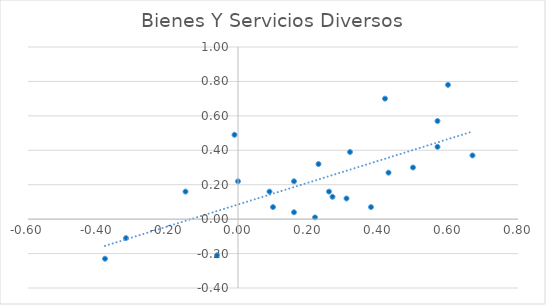
| Category | Bienes Y Servicios Diversos |
|---|---|
| 0.38 | 0.07 |
| -0.15 | 0.16 |
| -0.06 | -0.21 |
| 0.32 | 0.39 |
| -0.01 | 0.49 |
| 0.0 | 0.22 |
| -0.38 | -0.23 |
| -0.32 | -0.11 |
| 0.16 | 0.22 |
| 0.57 | 0.42 |
| 0.67 | 0.37 |
| 0.42 | 0.7 |
| 0.26 | 0.16 |
| 0.1 | 0.07 |
| 0.16 | 0.04 |
| 0.23 | 0.32 |
| 0.09 | 0.16 |
| 0.22 | 0.01 |
| 0.27 | 0.13 |
| 0.31 | 0.12 |
| 0.5 | 0.3 |
| 0.43 | 0.27 |
| 0.57 | 0.57 |
| 0.6 | 0.78 |